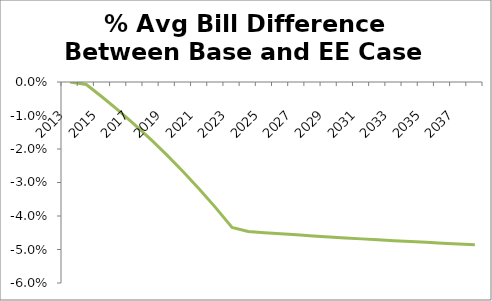
| Category | Bill Change |
|---|---|
| 2013.0 | 0 |
| 2014.0 | -0.001 |
| 2015.0 | -0.005 |
| 2016.0 | -0.009 |
| 2017.0 | -0.013 |
| 2018.0 | -0.017 |
| 2019.0 | -0.022 |
| 2020.0 | -0.027 |
| 2021.0 | -0.032 |
| 2022.0 | -0.038 |
| 2023.0 | -0.043 |
| 2024.0 | -0.045 |
| 2025.0 | -0.045 |
| 2026.0 | -0.045 |
| 2027.0 | -0.046 |
| 2028.0 | -0.046 |
| 2029.0 | -0.046 |
| 2030.0 | -0.047 |
| 2031.0 | -0.047 |
| 2032.0 | -0.047 |
| 2033.0 | -0.047 |
| 2034.0 | -0.048 |
| 2035.0 | -0.048 |
| 2036.0 | -0.048 |
| 2037.0 | -0.048 |
| 2038.0 | -0.049 |